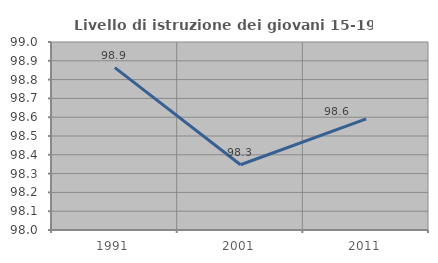
| Category | Livello di istruzione dei giovani 15-19 anni |
|---|---|
| 1991.0 | 98.864 |
| 2001.0 | 98.347 |
| 2011.0 | 98.592 |